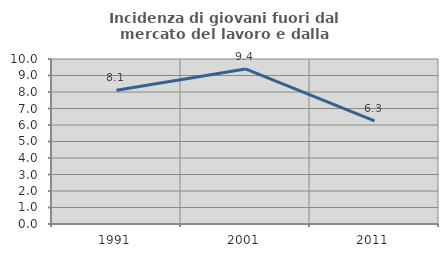
| Category | Incidenza di giovani fuori dal mercato del lavoro e dalla formazione  |
|---|---|
| 1991.0 | 8.108 |
| 2001.0 | 9.396 |
| 2011.0 | 6.25 |